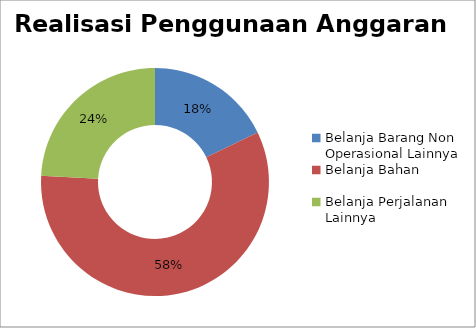
| Category | Series 0 |
|---|---|
| Belanja Barang Non Operasional Lainnya | 0.178 |
| Belanja Bahan | 0.58 |
| Belanja Perjalanan Lainnya | 0.241 |